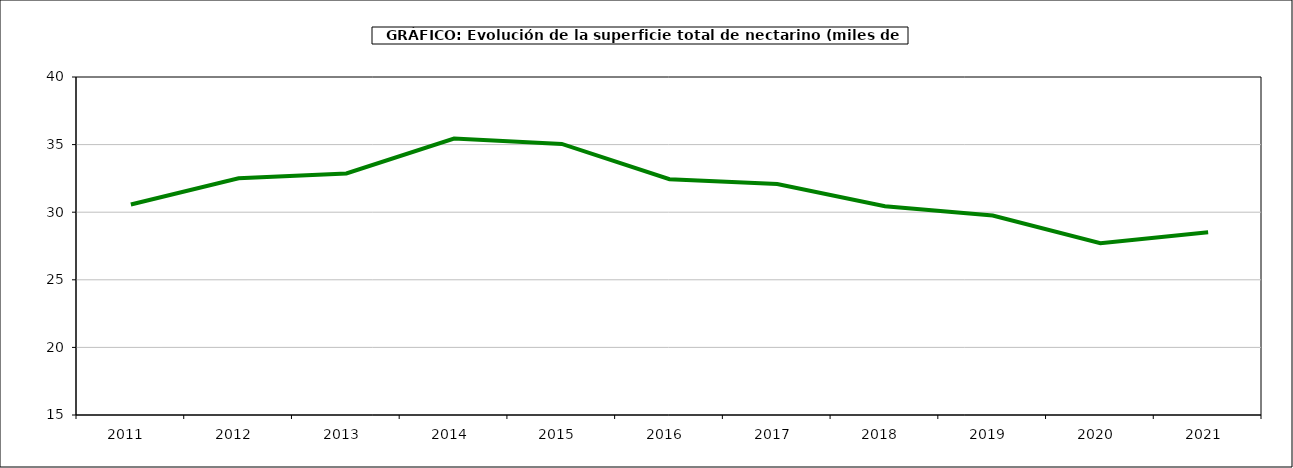
| Category | superficie melocotonero |
|---|---|
| 2011.0 | 30.569 |
| 2012.0 | 32.506 |
| 2013.0 | 32.867 |
| 2014.0 | 35.45 |
| 2015.0 | 35.048 |
| 2016.0 | 32.445 |
| 2017.0 | 32.078 |
| 2018.0 | 30.442 |
| 2019.0 | 29.757 |
| 2020.0 | 27.71 |
| 2021.0 | 28.517 |